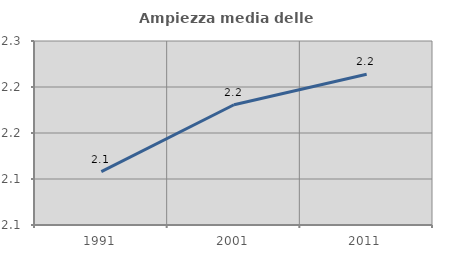
| Category | Ampiezza media delle famiglie |
|---|---|
| 1991.0 | 2.108 |
| 2001.0 | 2.181 |
| 2011.0 | 2.214 |